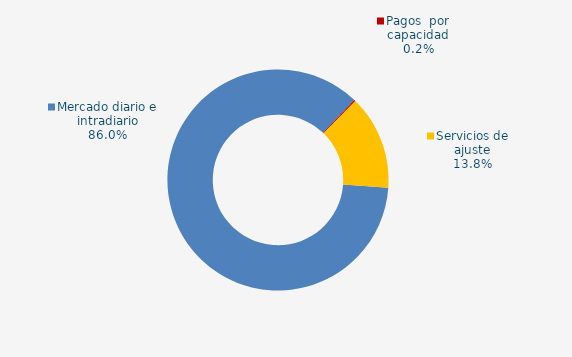
| Category | Series 0 |
|---|---|
| Mercado diario e intradiario | 74.42 |
| Pagos  por capacidad | 0.17 |
| Mecanismo ajuste RD-L 10/2022 | 0 |
| Servicios de ajuste | 11.93 |